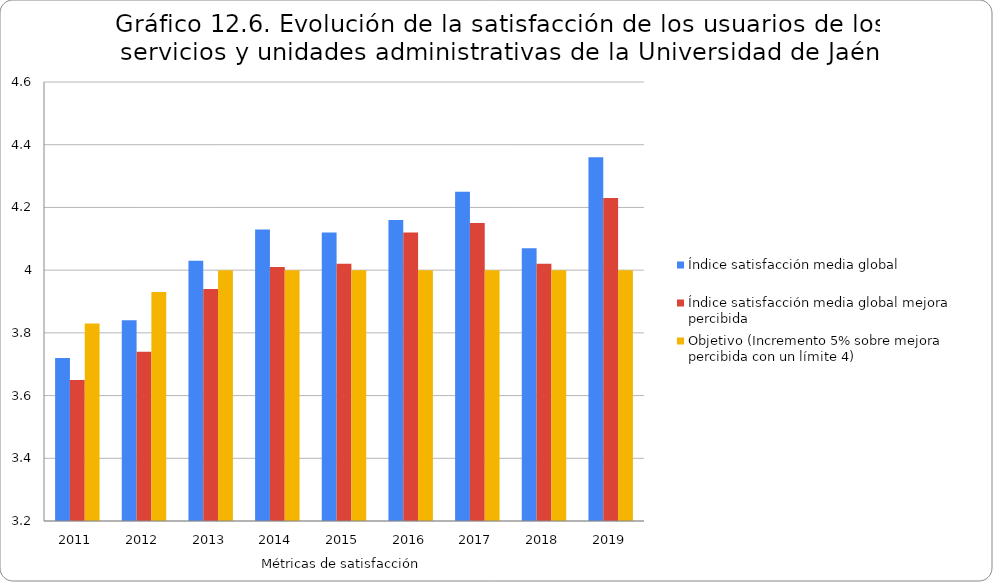
| Category | Índice satisfacción media global | Índice satisfacción media global mejora percibida | Objetivo (Incremento 5% sobre mejora percibida con un límite 4) |
|---|---|---|---|
| 2011.0 | 3.72 | 3.65 | 3.83 |
| 2012.0 | 3.84 | 3.74 | 3.93 |
| 2013.0 | 4.03 | 3.94 | 4 |
| 2014.0 | 4.13 | 4.01 | 4 |
| 2015.0 | 4.12 | 4.02 | 4 |
| 2016.0 | 4.16 | 4.12 | 4 |
| 2017.0 | 4.25 | 4.15 | 4 |
| 2018.0 | 4.07 | 4.02 | 4 |
| 2019.0 | 4.36 | 4.23 | 4 |